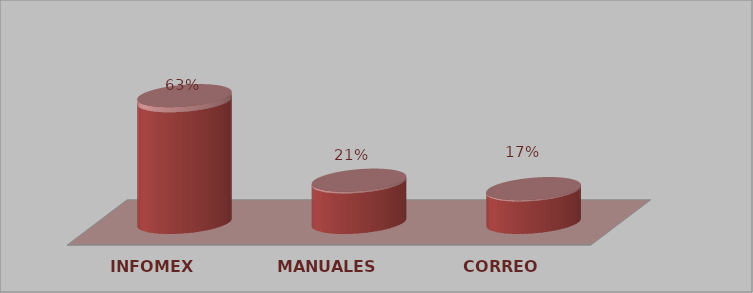
| Category | Series 0 | Series 1 |
|---|---|---|
| INFOMEX | 15 | 0.625 |
| MANUALES | 5 | 0.208 |
| CORREO | 4 | 0.167 |